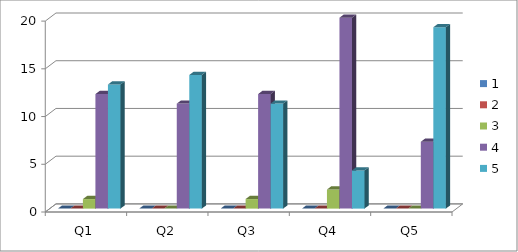
| Category | 1 | 2 | 3 | 4 | 5 |
|---|---|---|---|---|---|
| Q1 | 0 | 0 | 1 | 12 | 13 |
| Q2 | 0 | 0 | 0 | 11 | 14 |
| Q3 | 0 | 0 | 1 | 12 | 11 |
| Q4 | 0 | 0 | 2 | 20 | 4 |
| Q5 | 0 | 0 | 0 | 7 | 19 |